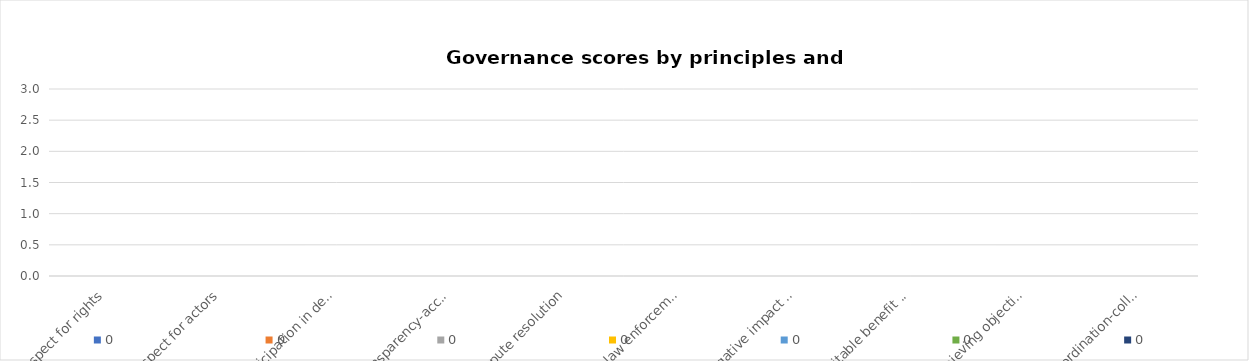
| Category | 0 |
|---|---|
| Respect for rights | 0 |
| Respect for actors | 0 |
| Participation in decisions | 0 |
| Transparency-accountability | 0 |
| Dispute resolution | 0 |
| Fair law enforcement | 0 |
| Negative impact mitigation | 0 |
| Equitable benefit sharing | 0 |
| Achieving objectives | 0 |
| Coordination-collaboration | 0 |